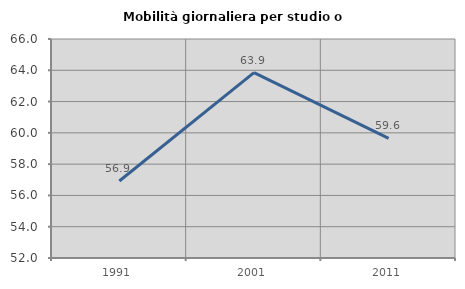
| Category | Mobilità giornaliera per studio o lavoro |
|---|---|
| 1991.0 | 56.923 |
| 2001.0 | 63.851 |
| 2011.0 | 59.649 |